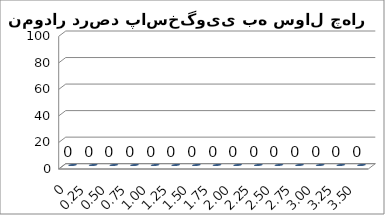
| Category | Series 0 |
|---|---|
| 0.0 | 0 |
| 0.25 | 0 |
| 0.5 | 0 |
| 0.75 | 0 |
| 1.0 | 0 |
| 1.25 | 0 |
| 1.5 | 0 |
| 1.75 | 0 |
| 2.0 | 0 |
| 2.25 | 0 |
| 2.5 | 0 |
| 2.75 | 0 |
| 3.0 | 0 |
| 3.25 | 0 |
| 3.5 | 0 |